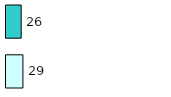
| Category | Series 0 | Series 1 |
|---|---|---|
| 0 | 29 | 26 |